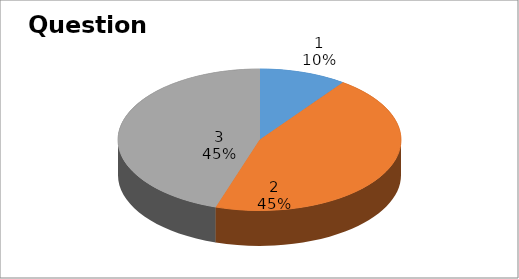
| Category | Series 0 |
|---|---|
| 0 | 2 |
| 1 | 9 |
| 2 | 9 |